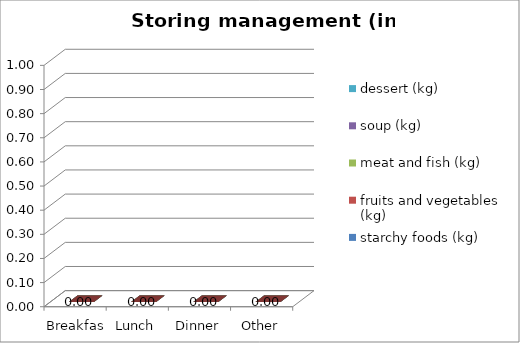
| Category | starchy foods (kg) | fruits and vegetables (kg) | meat and fish (kg) | soup (kg) | dessert (kg) |
|---|---|---|---|---|---|
| Breakfast | 0 | 0 | 0 | 0 | 0 |
| Lunch | 0 | 0 | 0 | 0 | 0 |
| Dinner | 0 | 0 | 0 | 0 | 0 |
| Other | 0 | 0 | 0 | 0 | 0 |